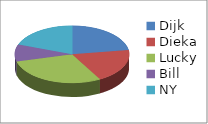
| Category | Series 0 | Series 1 |
|---|---|---|
| Dijk | 7 | 0.538 |
| Dieka | 6 | 0.462 |
| Lucky | 9 | 0.692 |
| Bill | 3 | 0.231 |
| NY | 6 | 0.462 |